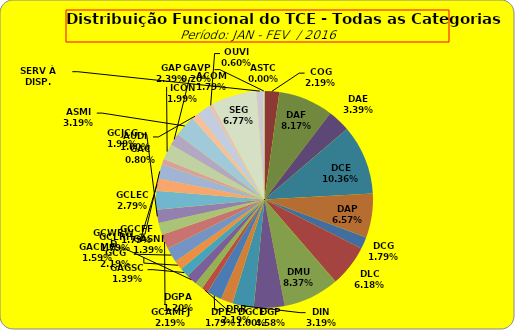
| Category | ASTC COG DAF DAE DCE DAP DCG DLC DMU DGP DIN DPE DRR DGCE DGPA GACMG GAGSC GASNI GCG GCAMFJ GCCFF GCJCG GCLEC GCLRH GCWRWD GAC GAP ACOM ASMI AUDI ICON OUVI SEG SERV À DISP. GAVP |
|---|---|
| ASTC | 0 |
| COG | 11 |
| DAF | 41 |
| DAE | 17 |
| DCE | 52 |
| DAP | 33 |
| DCG | 9 |
| DLC | 31 |
| DMU | 42 |
| DGP | 23 |
| DIN | 16 |
| DPE | 9 |
| DRR | 11 |
| DGCE | 5 |
| DGPA | 6 |
| GACMG | 8 |
| GAGSC | 7 |
| GASNI | 7 |
| GCG | 11 |
| GCAMFJ | 11 |
| GCCFF | 9 |
| GCJCG | 10 |
| GCLEC | 14 |
| GCLRH | 9 |
| GCWRWD | 11 |
| GAC | 4 |
| GAP | 12 |
| ACOM | 9 |
| ASMI | 16 |
| AUDI | 5 |
| ICON | 10 |
| OUVI | 3 |
| SEG | 34 |
| SERV À DISP. | 5 |
| GAVP | 1 |